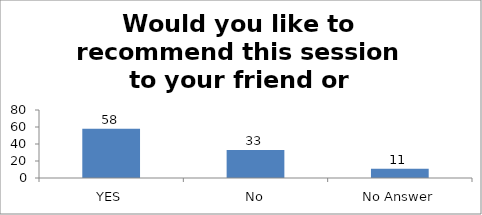
| Category | Would you like to recommend this session to your friend or colleague? |
|---|---|
| YES | 58 |
| No | 33 |
| No Answer | 11 |